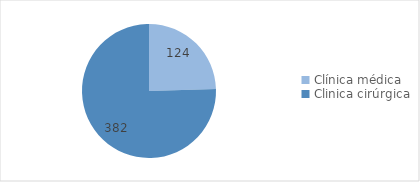
| Category | Series 0 |
|---|---|
| Clínica médica | 124 |
| Clinica cirúrgica | 382 |